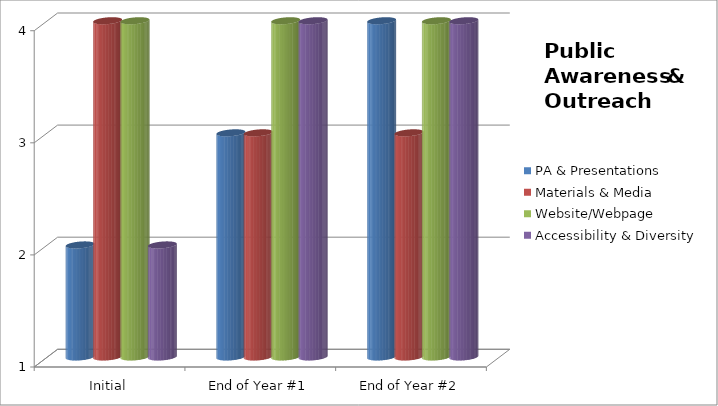
| Category | PA & Presentations  | Materials & Media  | Website/Webpage  | Accessibility & Diversity  |
|---|---|---|---|---|
| Initial | 2 | 4 | 4 | 2 |
| End of Year #1 | 3 | 3 | 4 | 4 |
| End of Year #2 | 4 | 3 | 4 | 4 |